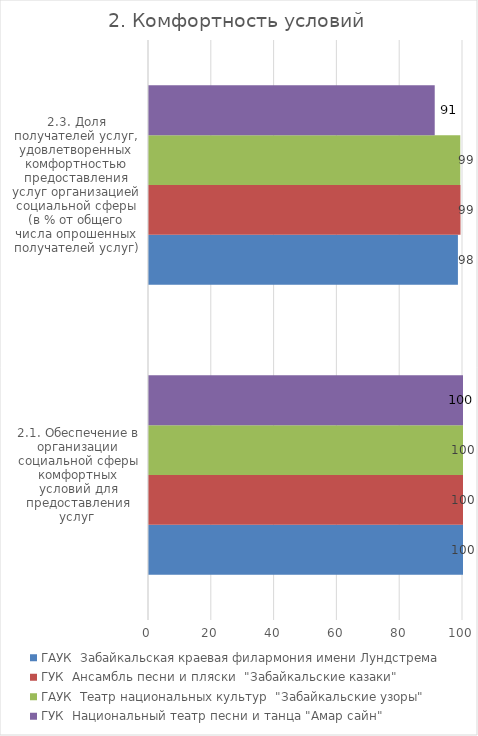
| Category | ГАУК  Забайкальская краевая филармония имени Лундстрема  | ГУК  Ансамбль песни и пляски  "Забайкальские казаки" | ГАУК  Театр национальных культур  "Забайкальские узоры" | ГУК  Национальный театр песни и танца "Амар сайн" |
|---|---|---|---|---|
| 2.1. Обеспечение в организации социальной сферы комфортных условий для предоставления услуг  | 100 | 100 | 100 | 100 |
| 2.3. Доля получателей услуг, удовлетворенных комфортностью предоставления услуг организацией социальной сферы (в % от общего числа опрошенных получателей услуг) | 98.382 | 99.205 | 99.137 | 90.995 |